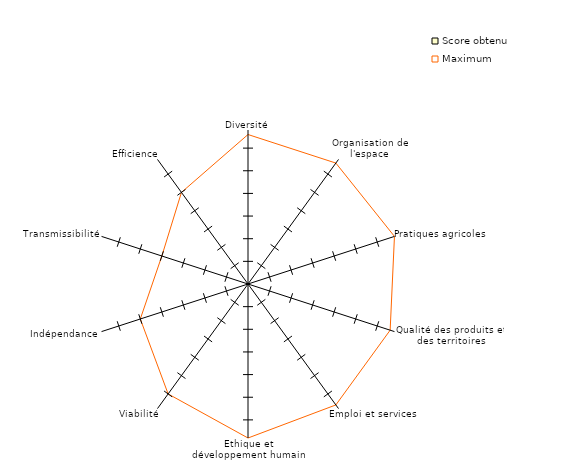
| Category | Score obtenu | Maximum |
|---|---|---|
| Diversité | 0 | 33 |
| Organisation de l'espace | 0 | 33 |
| Pratiques agricoles | 0 | 34 |
| Qualité des produits et des territoires | 0 | 33 |
| Emploi et services | 0 | 33 |
| Ethique et développement humain | 0 | 34 |
| Viabilité | 0 | 30 |
| Indépendance | 0 | 25 |
| Transmissibilité | 0 | 20 |
| Efficience | 0 | 25 |